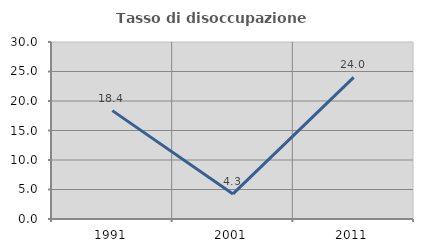
| Category | Tasso di disoccupazione giovanile  |
|---|---|
| 1991.0 | 18.367 |
| 2001.0 | 4.255 |
| 2011.0 | 24 |